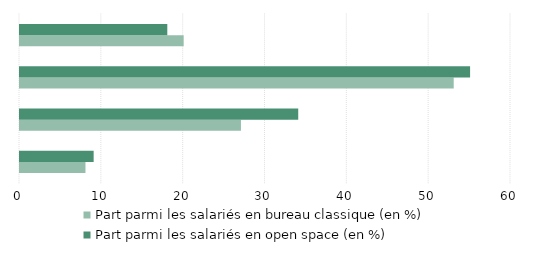
| Category | Part parmi les salariés en bureau classique (en %) | Part parmi les salariés en open space (en %) |
|---|---|---|
| 0 | 8 | 9 |
| 1 | 27 | 34 |
| 2 | 53 | 55 |
| 3 | 20 | 18 |